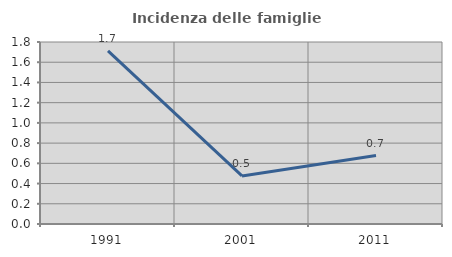
| Category | Incidenza delle famiglie numerose |
|---|---|
| 1991.0 | 1.713 |
| 2001.0 | 0.475 |
| 2011.0 | 0.677 |